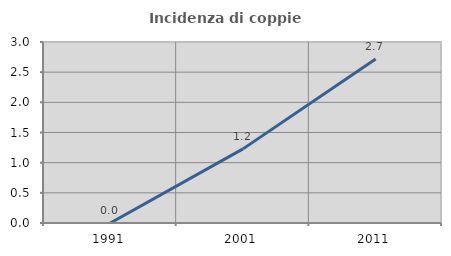
| Category | Incidenza di coppie miste |
|---|---|
| 1991.0 | 0 |
| 2001.0 | 1.229 |
| 2011.0 | 2.717 |